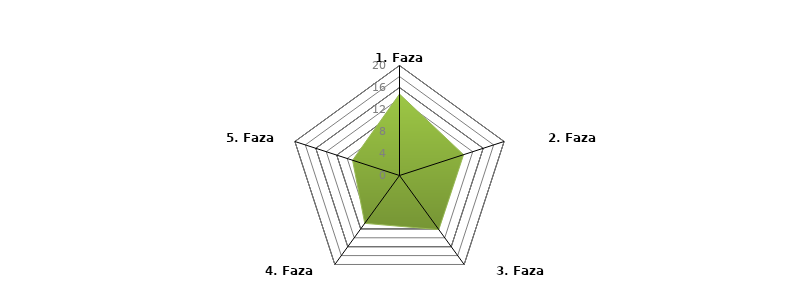
| Category | Series 0 | BENCHMARK |
|---|---|---|
| 1. Faza analizy |  | 14.806 |
| 2. Faza projektowania |  | 12.25 |
| 3. Faza przygotowania |  | 12.167 |
| 4. Faza wdrożenia |  | 10.75 |
| 5. Faza oceny |  | 8.972 |